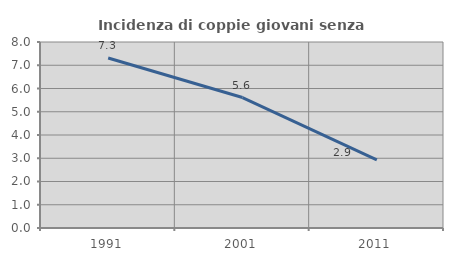
| Category | Incidenza di coppie giovani senza figli |
|---|---|
| 1991.0 | 7.312 |
| 2001.0 | 5.611 |
| 2011.0 | 2.93 |